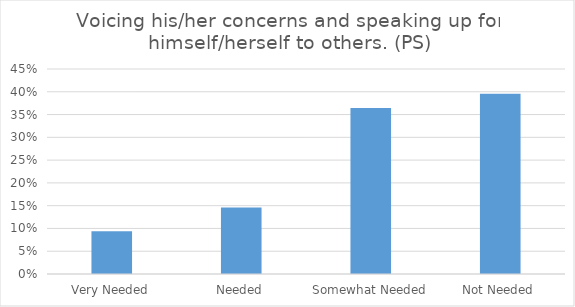
| Category | Voicing his/her concerns and speaking up for himself/herself to others. (PS) |
|---|---|
| Very Needed | 0.094 |
| Needed | 0.146 |
| Somewhat Needed | 0.365 |
| Not Needed | 0.396 |